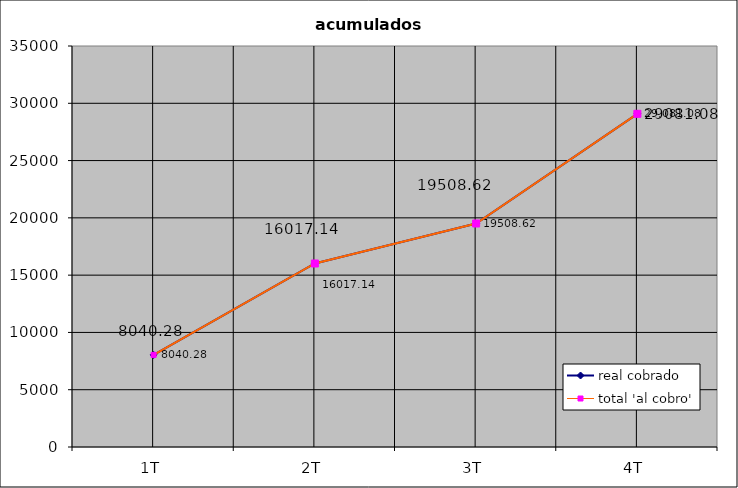
| Category | real cobrado | total 'al cobro' |
|---|---|---|
| 1T | 8040.28 | 8040.28 |
| 2T | 16017.14 | 16017.14 |
| 3T | 19508.62 | 19508.62 |
| 4T | 29081.08 | 29081.08 |